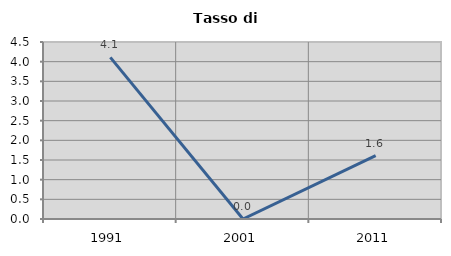
| Category | Tasso di disoccupazione   |
|---|---|
| 1991.0 | 4.11 |
| 2001.0 | 0 |
| 2011.0 | 1.613 |